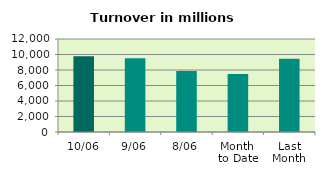
| Category | Series 0 |
|---|---|
| 10/06 | 9777.82 |
| 9/06 | 9503.908 |
| 8/06 | 7875.416 |
| Month 
to Date | 7484.396 |
| Last
Month | 9444.716 |